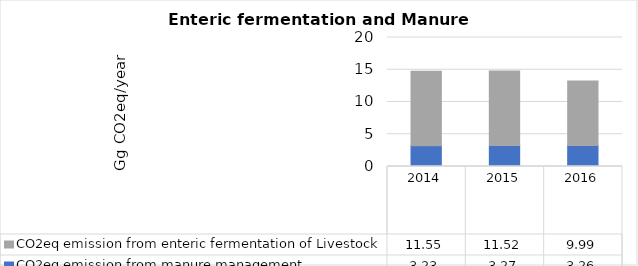
| Category | CO2eq emission from manure management | CO2eq emission from enteric fermentation of Livestock |
|---|---|---|
| 2014.0 | 3.23 | 11.55 |
| 2015.0 | 3.27 | 11.52 |
| 2016.0 | 3.26 | 9.99 |